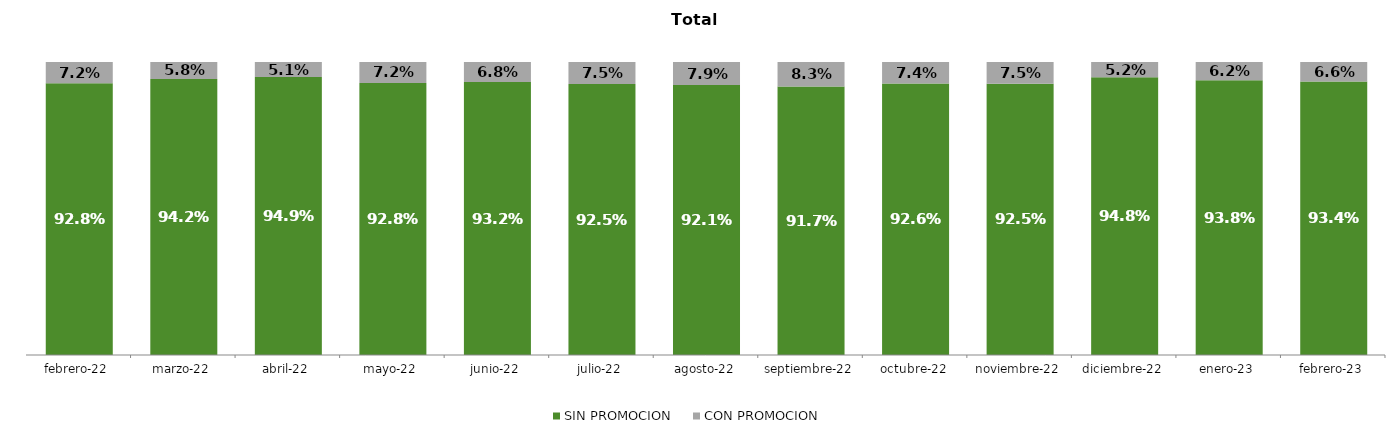
| Category | SIN PROMOCION   | CON PROMOCION   |
|---|---|---|
| 2022-02-01 | 0.928 | 0.072 |
| 2022-03-01 | 0.942 | 0.058 |
| 2022-04-01 | 0.949 | 0.051 |
| 2022-05-01 | 0.928 | 0.072 |
| 2022-06-01 | 0.932 | 0.068 |
| 2022-07-01 | 0.925 | 0.075 |
| 2022-08-01 | 0.921 | 0.079 |
| 2022-09-01 | 0.917 | 0.083 |
| 2022-10-01 | 0.926 | 0.074 |
| 2022-11-01 | 0.925 | 0.075 |
| 2022-12-01 | 0.948 | 0.052 |
| 2023-01-01 | 0.938 | 0.062 |
| 2023-02-01 | 0.934 | 0.066 |